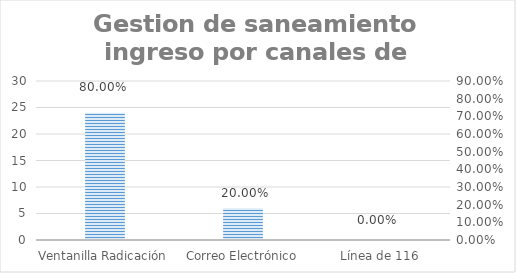
| Category | Series 0 |
|---|---|
| Ventanilla Radicación | 24 |
| Correo Electrónico | 6 |
| Línea de 116 | 0 |